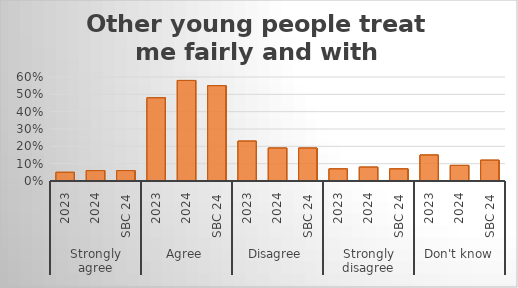
| Category | Other young people treat me fairly and with respect. |
|---|---|
| 0 | 0.05 |
| 1 | 0.06 |
| 2 | 0.06 |
| 3 | 0.48 |
| 4 | 0.58 |
| 5 | 0.55 |
| 6 | 0.23 |
| 7 | 0.19 |
| 8 | 0.19 |
| 9 | 0.07 |
| 10 | 0.08 |
| 11 | 0.07 |
| 12 | 0.15 |
| 13 | 0.09 |
| 14 | 0.12 |